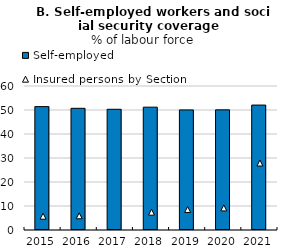
| Category | Self-employed |
|---|---|
| 2015.0 | 51.408 |
| 2016.0 | 50.699 |
| 2017.0 | 50.303 |
| 2018.0 | 51.185 |
| 2019.0 | 50.029 |
| 2020.0 | 50.063 |
| 2021.0 | 52.057 |